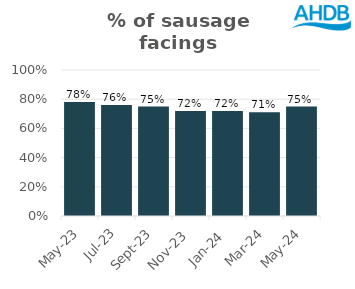
| Category | Sausage |
|---|---|
| 2023-05-01 | 0.78 |
| 2023-07-01 | 0.76 |
| 2023-09-01 | 0.75 |
| 2023-11-01 | 0.72 |
| 2024-01-01 | 0.72 |
| 2024-03-01 | 0.71 |
| 2024-05-01 | 0.75 |